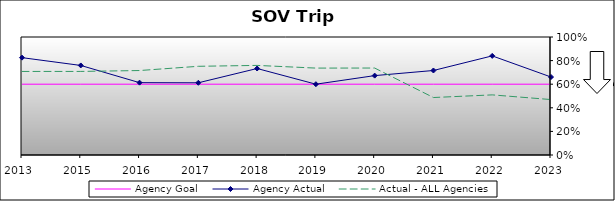
| Category | Agency Goal | Agency Actual | Actual - ALL Agencies |
|---|---|---|---|
| 2013.0 | 0.6 | 0.825 | 0.708 |
| 2015.0 | 0.6 | 0.759 | 0.708 |
| 2016.0 | 0.6 | 0.613 | 0.716 |
| 2017.0 | 0.6 | 0.612 | 0.752 |
| 2018.0 | 0.6 | 0.733 | 0.759 |
| 2019.0 | 0.6 | 0.6 | 0.736 |
| 2020.0 | 0.6 | 0.673 | 0.737 |
| 2021.0 | 0.6 | 0.716 | 0.487 |
| 2022.0 | 0.6 | 0.84 | 0.509 |
| 2023.0 | 0.6 | 0.661 | 0.47 |